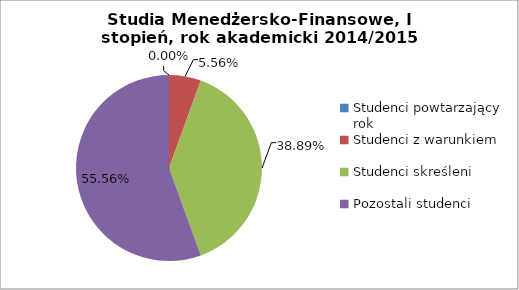
| Category | Series 0 |
|---|---|
| Studenci powtarzający rok | 0 |
| Studenci z warunkiem | 1 |
| Studenci skreśleni | 7 |
| Pozostali studenci | 10 |